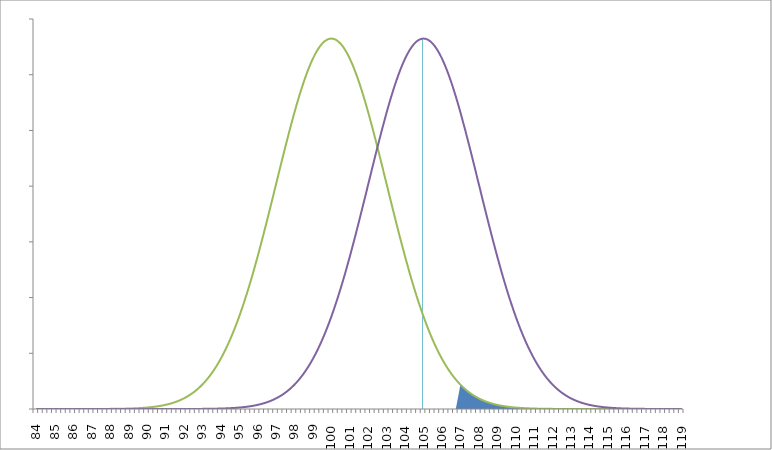
| Category | Series 4 |
|---|---|
| 84.0 | 0 |
| 84.25 | 0 |
| 84.5 | 0 |
| 84.75 | 0 |
| 85.0 | 0 |
| 85.25 | 0 |
| 85.5 | 0 |
| 85.75 | 0 |
| 86.0 | 0 |
| 86.25 | 0 |
| 86.5 | 0 |
| 86.75 | 0 |
| 87.0 | 0 |
| 87.25 | 0 |
| 87.5 | 0 |
| 87.75 | 0 |
| 88.0 | 0 |
| 88.25 | 0 |
| 88.5 | 0 |
| 88.75 | 0 |
| 89.0 | 0 |
| 89.25 | 0 |
| 89.5 | 0 |
| 89.75 | 0 |
| 90.0 | 0 |
| 90.25 | 0 |
| 90.5 | 0 |
| 90.75 | 0 |
| 91.0 | 0 |
| 91.25 | 0 |
| 91.5 | 0 |
| 91.75 | 0 |
| 92.0 | 0 |
| 92.25 | 0 |
| 92.5 | 0 |
| 92.75 | 0 |
| 93.0 | 0 |
| 93.25 | 0 |
| 93.5 | 0 |
| 93.75 | 0 |
| 94.0 | 0 |
| 94.25 | 0 |
| 94.5 | 0 |
| 94.75 | 0 |
| 95.0 | 0 |
| 95.25 | 0 |
| 95.5 | 0 |
| 95.75 | 0 |
| 96.0 | 0 |
| 96.25 | 0 |
| 96.5 | 0 |
| 96.75 | 0 |
| 97.0 | 0 |
| 97.25 | 0 |
| 97.5 | 0 |
| 97.75 | 0 |
| 98.0 | 0 |
| 98.25 | 0 |
| 98.5 | 0 |
| 98.75 | 0 |
| 99.0 | 0 |
| 99.25 | 0 |
| 99.5 | 0 |
| 99.75 | 0 |
| 100.0 | 0 |
| 100.25 | 0 |
| 100.5 | 0 |
| 100.75 | 0 |
| 101.0 | 0 |
| 101.25 | 0 |
| 101.5 | 0 |
| 101.75 | 0 |
| 102.0 | 0 |
| 102.25 | 0 |
| 102.5 | 0 |
| 102.75 | 0 |
| 103.0 | 0 |
| 103.25 | 0 |
| 103.5 | 0 |
| 103.75 | 0 |
| 104.0 | 0 |
| 104.25 | 0 |
| 104.5 | 0 |
| 104.75 | 0 |
| 105.0 | 0.133 |
| 105.25 | 0 |
| 105.5 | 0 |
| 105.75 | 0 |
| 106.0 | 0 |
| 106.25 | 0 |
| 106.5 | 0 |
| 106.75 | 0 |
| 107.0 | 0 |
| 107.25 | 0 |
| 107.5 | 0 |
| 107.75 | 0 |
| 108.0 | 0 |
| 108.25 | 0 |
| 108.5 | 0 |
| 108.75 | 0 |
| 109.0 | 0 |
| 109.25 | 0 |
| 109.5 | 0 |
| 109.75 | 0 |
| 110.0 | 0 |
| 110.25 | 0 |
| 110.5 | 0 |
| 110.75 | 0 |
| 111.0 | 0 |
| 111.25 | 0 |
| 111.5 | 0 |
| 111.75 | 0 |
| 112.0 | 0 |
| 112.25 | 0 |
| 112.5 | 0 |
| 112.75 | 0 |
| 113.0 | 0 |
| 113.25 | 0 |
| 113.5 | 0 |
| 113.75 | 0 |
| 114.0 | 0 |
| 114.25 | 0 |
| 114.5 | 0 |
| 114.75 | 0 |
| 115.0 | 0 |
| 115.25 | 0 |
| 115.5 | 0 |
| 115.75 | 0 |
| 116.0 | 0 |
| 116.25 | 0 |
| 116.5 | 0 |
| 116.75 | 0 |
| 117.0 | 0 |
| 117.25 | 0 |
| 117.5 | 0 |
| 117.75 | 0 |
| 118.0 | 0 |
| 118.25 | 0 |
| 118.5 | 0 |
| 118.75 | 0 |
| 119.0 | 0 |